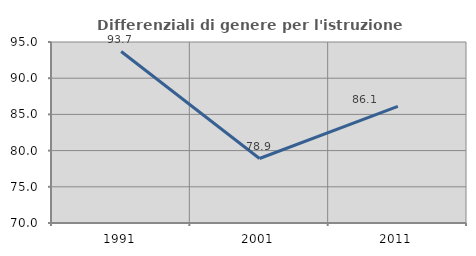
| Category | Differenziali di genere per l'istruzione superiore |
|---|---|
| 1991.0 | 93.683 |
| 2001.0 | 78.909 |
| 2011.0 | 86.105 |